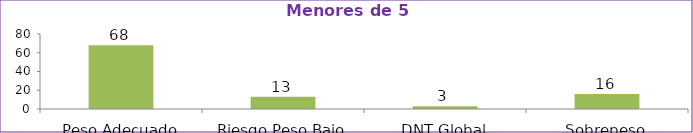
| Category | Series 0 |
|---|---|
| Peso Adecuado | 68 |
| Riesgo Peso Bajo | 13 |
| DNT Global | 3 |
| Sobrepeso | 16 |